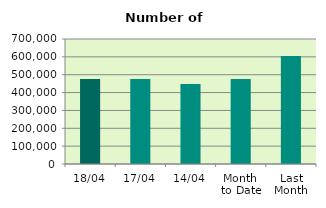
| Category | Series 0 |
|---|---|
| 18/04 | 476402 |
| 17/04 | 475658 |
| 14/04 | 447884 |
| Month 
to Date | 475681.6 |
| Last
Month | 605064 |